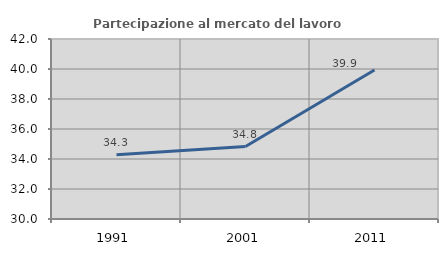
| Category | Partecipazione al mercato del lavoro  femminile |
|---|---|
| 1991.0 | 34.288 |
| 2001.0 | 34.832 |
| 2011.0 | 39.932 |